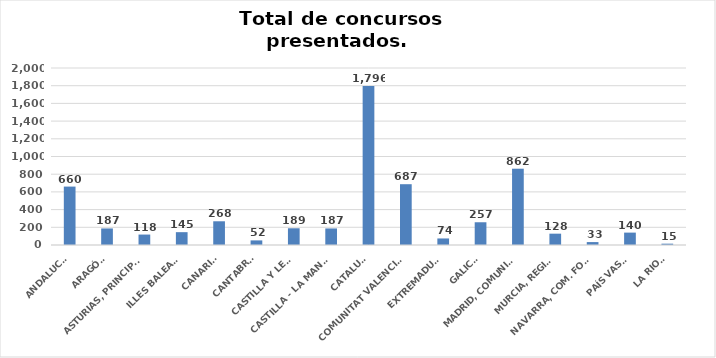
| Category | Series 0 |
|---|---|
| ANDALUCÍA | 660 |
| ARAGÓN | 187 |
| ASTURIAS, PRINCIPADO | 118 |
| ILLES BALEARS | 145 |
| CANARIAS | 268 |
| CANTABRIA | 52 |
| CASTILLA Y LEÓN | 189 |
| CASTILLA - LA MANCHA | 187 |
| CATALUÑA | 1796 |
| COMUNITAT VALENCIANA | 687 |
| EXTREMADURA | 74 |
| GALICIA | 257 |
| MADRID, COMUNIDAD | 862 |
| MURCIA, REGIÓN | 128 |
| NAVARRA, COM. FORAL | 33 |
| PAÍS VASCO | 140 |
| LA RIOJA | 15 |